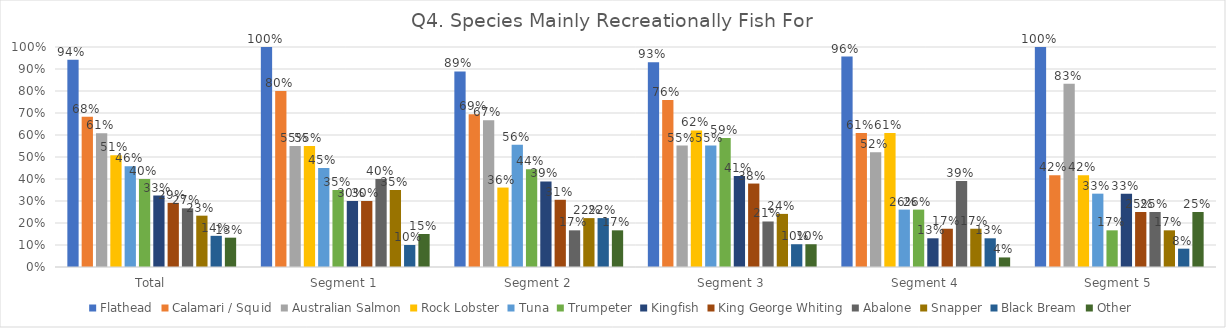
| Category | Flathead | Calamari / Squid | Australian Salmon | Rock Lobster | Tuna | Trumpeter | Kingfish | King George Whiting | Abalone | Snapper | Black Bream | Other |
|---|---|---|---|---|---|---|---|---|---|---|---|---|
| Total | 0.942 | 0.683 | 0.608 | 0.508 | 0.458 | 0.4 | 0.325 | 0.292 | 0.267 | 0.233 | 0.142 | 0.133 |
| Segment 1 | 1 | 0.8 | 0.55 | 0.55 | 0.45 | 0.35 | 0.3 | 0.3 | 0.4 | 0.35 | 0.1 | 0.15 |
| Segment 2 | 0.889 | 0.694 | 0.667 | 0.361 | 0.556 | 0.444 | 0.389 | 0.306 | 0.167 | 0.222 | 0.222 | 0.167 |
| Segment 3 | 0.931 | 0.759 | 0.552 | 0.621 | 0.552 | 0.586 | 0.414 | 0.379 | 0.207 | 0.241 | 0.103 | 0.103 |
| Segment 4 | 0.957 | 0.609 | 0.522 | 0.609 | 0.261 | 0.261 | 0.13 | 0.174 | 0.391 | 0.174 | 0.13 | 0.043 |
| Segment 5 | 1 | 0.417 | 0.833 | 0.417 | 0.333 | 0.167 | 0.333 | 0.25 | 0.25 | 0.167 | 0.083 | 0.25 |